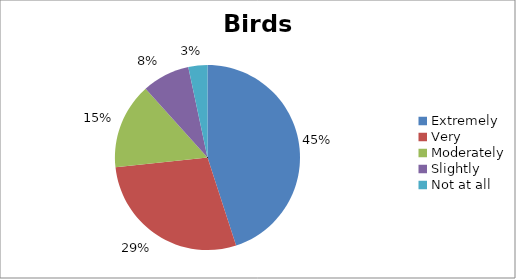
| Category | Birds |
|---|---|
| Extremely | 27 |
| Very | 17 |
| Moderately | 9 |
| Slightly | 5 |
| Not at all | 2 |